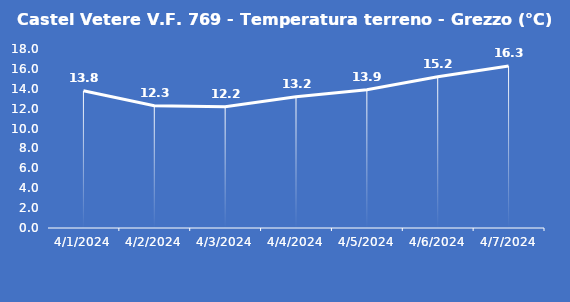
| Category | Castel Vetere V.F. 769 - Temperatura terreno - Grezzo (°C) |
|---|---|
| 4/1/24 | 13.8 |
| 4/2/24 | 12.3 |
| 4/3/24 | 12.2 |
| 4/4/24 | 13.2 |
| 4/5/24 | 13.9 |
| 4/6/24 | 15.2 |
| 4/7/24 | 16.3 |